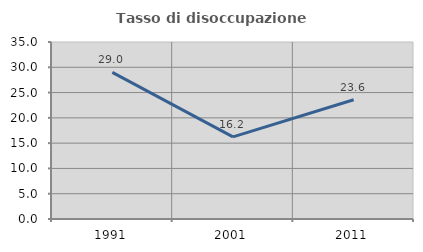
| Category | Tasso di disoccupazione giovanile  |
|---|---|
| 1991.0 | 29.001 |
| 2001.0 | 16.236 |
| 2011.0 | 23.579 |